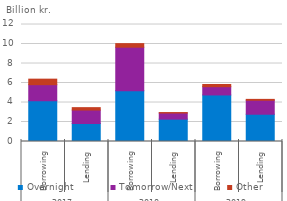
| Category | Overnight | Tomorrow/Next | Other |
|---|---|---|---|
| 0 | 4.18 | 1.648 | 0.567 |
| 1 | 1.848 | 1.377 | 0.248 |
| 2 | 5.205 | 4.469 | 0.365 |
| 3 | 2.292 | 0.628 | 0.046 |
| 4 | 4.774 | 0.846 | 0.229 |
| 5 | 2.797 | 1.434 | 0.09 |